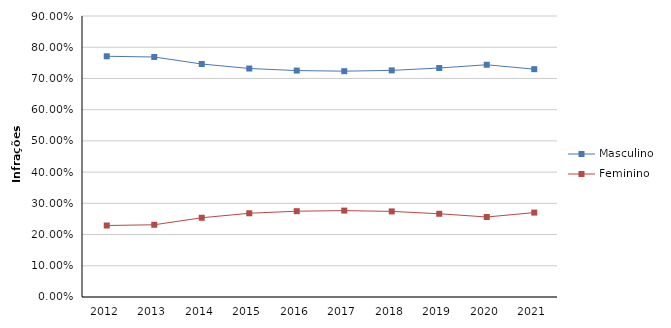
| Category | Masculino | Feminino |
|---|---|---|
| 2012 | 0.771 | 0.229 |
| 2013 | 0.769 | 0.231 |
| 2014 | 0.746 | 0.254 |
| 2015 | 0.732 | 0.268 |
| 2016 | 0.725 | 0.275 |
| 2017 | 0.723 | 0.277 |
| 2018 | 0.726 | 0.274 |
| 2019 | 0.733 | 0.267 |
| 2020 | 0.744 | 0.256 |
| 2021 | 0.73 | 0.27 |